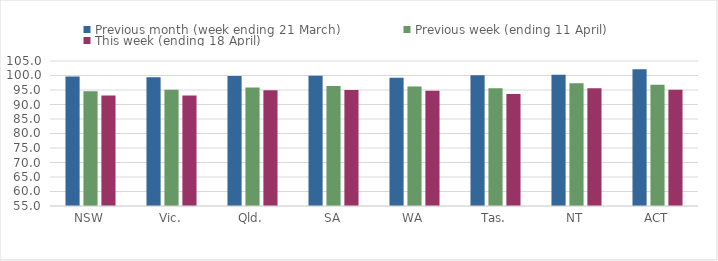
| Category | Previous month (week ending 21 March) | Previous week (ending 11 April) | This week (ending 18 April) |
|---|---|---|---|
| NSW | 99.644 | 94.586 | 93.14 |
| Vic. | 99.429 | 95.106 | 93.123 |
| Qld. | 99.845 | 95.867 | 94.908 |
| SA | 99.956 | 96.407 | 95.028 |
| WA | 99.204 | 96.225 | 94.765 |
| Tas. | 100.061 | 95.566 | 93.662 |
| NT | 100.276 | 97.347 | 95.6 |
| ACT | 102.14 | 96.79 | 95.11 |